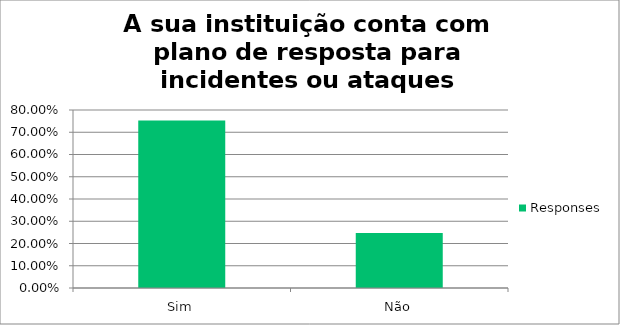
| Category | Responses |
|---|---|
| Sim | 0.753 |
| Não | 0.247 |